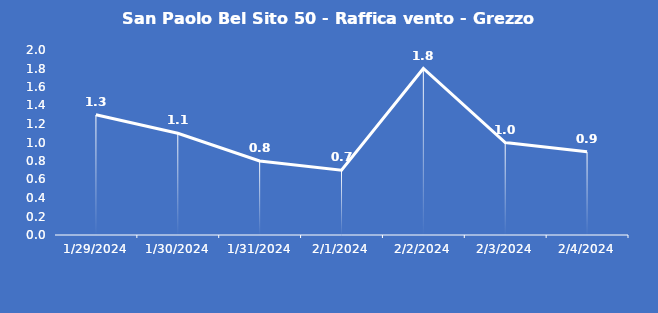
| Category | San Paolo Bel Sito 50 - Raffica vento - Grezzo (m/s) |
|---|---|
| 1/29/24 | 1.3 |
| 1/30/24 | 1.1 |
| 1/31/24 | 0.8 |
| 2/1/24 | 0.7 |
| 2/2/24 | 1.8 |
| 2/3/24 | 1 |
| 2/4/24 | 0.9 |